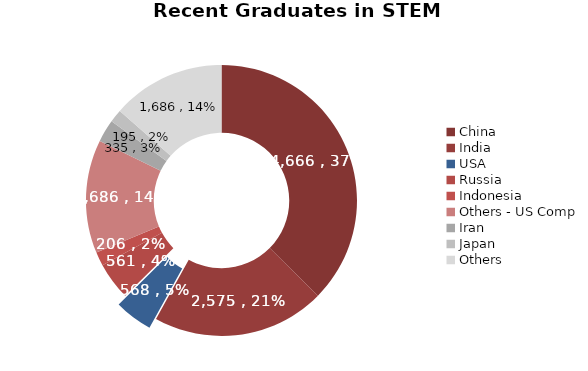
| Category | Series 0 |
|---|---|
| China | 4666 |
| India | 2575 |
| USA | 568 |
| Russia | 561 |
| Indonesia | 206 |
| Others - US Comp | 1686 |
| Iran | 335 |
| Japan | 195 |
| Others | 1686 |